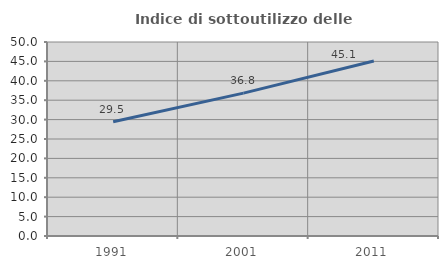
| Category | Indice di sottoutilizzo delle abitazioni  |
|---|---|
| 1991.0 | 29.463 |
| 2001.0 | 36.82 |
| 2011.0 | 45.09 |